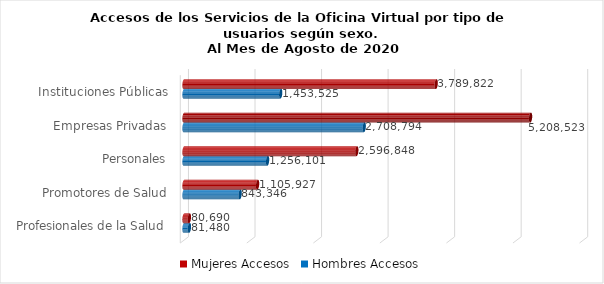
| Category | Mujeres | Hombres |
|---|---|---|
| Instituciones Públicas | 3789822 | 1453525 |
| Empresas Privadas | 5208523 | 2708794 |
| Personales | 2596848 | 1256101 |
| Promotores de Salud | 1105927 | 843346 |
| Profesionales de la Salud | 80690 | 81480 |